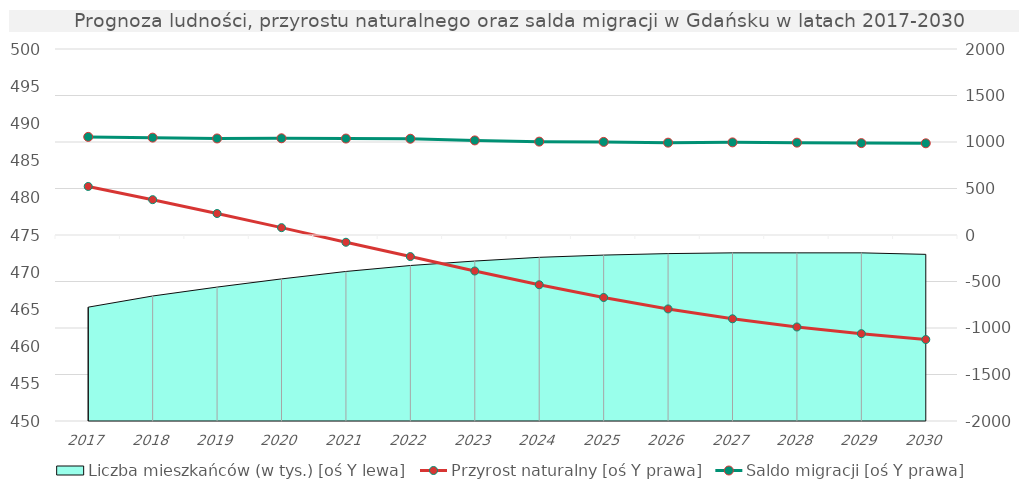
| Category | Przyrost naturalny [oś Y prawa] | Saldo migracji [oś Y prawa] |
|---|---|---|
| 2017.0 | 522 | 1055 |
| 2018.0 | 380 | 1047 |
| 2019.0 | 231 | 1038 |
| 2020.0 | 79 | 1040 |
| 2021.0 | -78 | 1037 |
| 2022.0 | -232 | 1035 |
| 2023.0 | -387 | 1017 |
| 2024.0 | -535 | 1004 |
| 2025.0 | -672 | 1001 |
| 2026.0 | -795 | 993 |
| 2027.0 | -901 | 996 |
| 2028.0 | -989 | 993 |
| 2029.0 | -1061 | 988 |
| 2030.0 | -1124 | 986 |